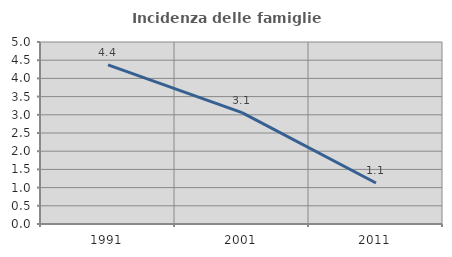
| Category | Incidenza delle famiglie numerose |
|---|---|
| 1991.0 | 4.37 |
| 2001.0 | 3.059 |
| 2011.0 | 1.126 |